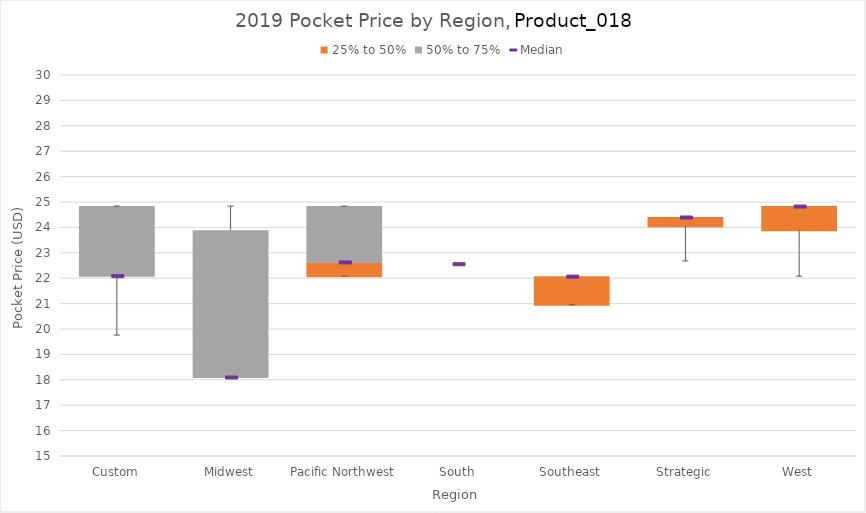
| Category | Bottom | 25% to 50% | 50% to 75% |
|---|---|---|---|
| Custom | 22.1 | 0 | 2.74 |
| Midwest | 18.11 | 0 | 5.78 |
| Pacific Northwest | 22.08 | 0.56 | 2.2 |
| South | 22.57 | 0 | 0 |
| Southeast | 20.95 | 1.13 | 0 |
| Strategic | 24.05 | 0.36 | 0 |
| West | 23.89 | 0.95 | 0 |